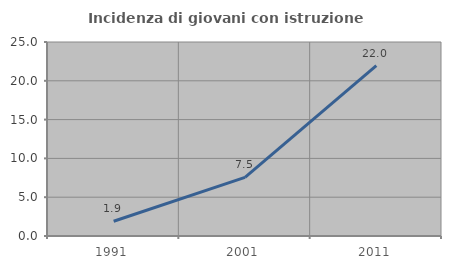
| Category | Incidenza di giovani con istruzione universitaria |
|---|---|
| 1991.0 | 1.905 |
| 2001.0 | 7.547 |
| 2011.0 | 21.951 |